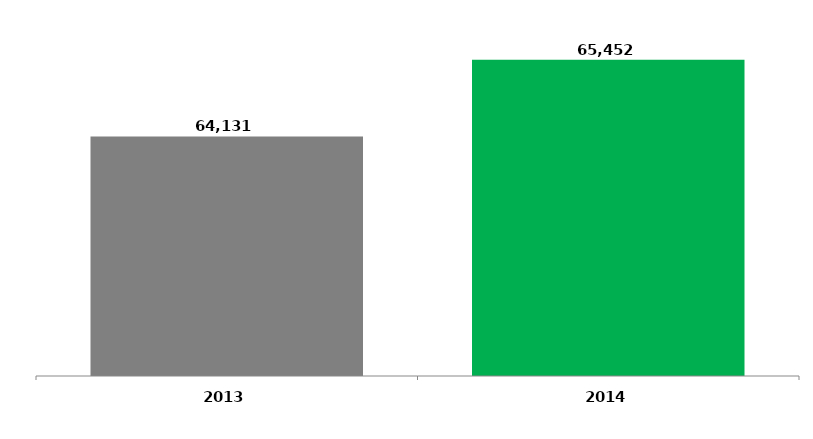
| Category | Series 0 |
|---|---|
| 2013.0 | 64131 |
| 2014.0 | 65452 |